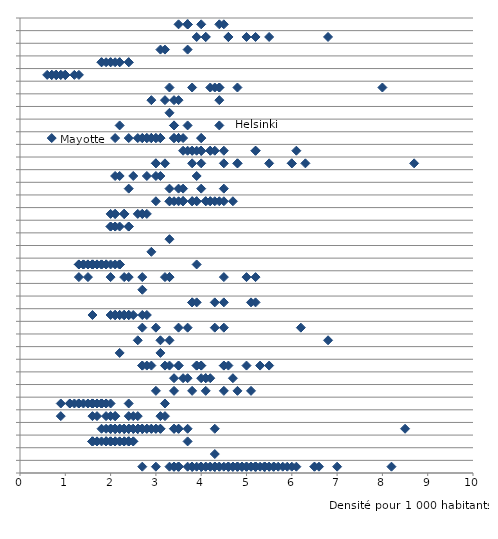
| Category | Series 0 |
|---|---|
| 3.7 | 35.5 |
| 3.7 | 35.5 |
| 3.7 | 35.5 |
| 4.0 | 35.5 |
| 3.5 | 35.5 |
| 3.7 | 35.5 |
| 4.5 | 35.5 |
| 4.4 | 35.5 |
| 3.9 | 34.5 |
| 4.6 | 34.5 |
| 6.8 | 34.5 |
| 4.6 | 34.5 |
| 5.0 | 34.5 |
| 4.1 | 34.5 |
| 5.5 | 34.5 |
| 5.2 | 34.5 |
| 4.1 | 34.5 |
| 3.7 | 33.5 |
| 3.2 | 33.5 |
| 3.1 | 33.5 |
| 2.4 | 32.5 |
| 2.2 | 32.5 |
| 2.4 | 32.5 |
| 2.2 | 32.5 |
| 2.0 | 32.5 |
| 1.9 | 32.5 |
| 2.0 | 32.5 |
| 1.8 | 32.5 |
| 1.8 | 32.5 |
| 2.1 | 32.5 |
| 0.8 | 31.5 |
| 0.6 | 31.5 |
| 0.8 | 31.5 |
| 0.7 | 31.5 |
| 0.9 | 31.5 |
| 0.7 | 31.5 |
| 0.7 | 31.5 |
| 1.0 | 31.5 |
| 0.9 | 31.5 |
| 1.0 | 31.5 |
| 1.3 | 31.5 |
| 1.2 | 31.5 |
| 0.8 | 31.5 |
| 1.0 | 31.5 |
| 0.8 | 31.5 |
| 8.0 | 30.5 |
| 3.3 | 30.5 |
| 4.4 | 30.5 |
| 3.8 | 30.5 |
| 4.2 | 30.5 |
| 4.8 | 30.5 |
| 4.4 | 30.5 |
| 4.3 | 30.5 |
| 4.4 | 29.5 |
| 3.2 | 29.5 |
| 3.4 | 29.5 |
| 3.5 | 29.5 |
| 2.9 | 29.5 |
| 3.3 | 28.5 |
| 3.4 | 27.5 |
| 4.4 | 27.5 |
| 3.4 | 27.5 |
| 3.7 | 27.5 |
| 2.2 | 27.5 |
| 4.0 | 26.5 |
| 2.9 | 26.5 |
| 2.6 | 26.5 |
| 2.8 | 26.5 |
| 2.7 | 26.5 |
| 3.0 | 26.5 |
| 2.9 | 26.5 |
| 3.1 | 26.5 |
| 3.1 | 26.5 |
| 3.5 | 26.5 |
| 3.0 | 26.5 |
| 2.8 | 26.5 |
| 3.1 | 26.5 |
| 2.9 | 26.5 |
| 3.5 | 26.5 |
| 3.5 | 26.5 |
| 3.4 | 26.5 |
| 3.4 | 26.5 |
| 3.1 | 26.5 |
| 3.6 | 26.5 |
| 4.0 | 26.5 |
| 2.9 | 26.5 |
| 2.4 | 26.5 |
| 2.7 | 26.5 |
| 2.1 | 26.5 |
| 3.1 | 26.5 |
| 0.7 | 26.5 |
| 4.0 | 25.5 |
| 4.3 | 25.5 |
| 5.2 | 25.5 |
| 3.6 | 25.5 |
| 5.2 | 25.5 |
| 6.1 | 25.5 |
| 4.0 | 25.5 |
| 4.2 | 25.5 |
| 3.7 | 25.5 |
| 4.2 | 25.5 |
| 3.8 | 25.5 |
| 4.5 | 25.5 |
| 3.9 | 25.5 |
| 3.8 | 25.5 |
| 4.0 | 25.5 |
| 4.0 | 25.5 |
| 8.7 | 24.5 |
| 4.0 | 24.5 |
| 3.2 | 24.5 |
| 6.3 | 24.5 |
| 4.8 | 24.5 |
| 6.0 | 24.5 |
| 3.0 | 24.5 |
| 6.0 | 24.5 |
| 4.8 | 24.5 |
| 4.5 | 24.5 |
| 5.5 | 24.5 |
| 3.0 | 24.5 |
| 3.8 | 24.5 |
| 3.9 | 23.5 |
| 2.2 | 23.5 |
| 2.5 | 23.5 |
| 3.1 | 23.5 |
| 2.1 | 23.5 |
| 2.8 | 23.5 |
| 3.0 | 23.5 |
| 3.5 | 22.5 |
| 2.4 | 22.5 |
| 3.6 | 22.5 |
| 4.0 | 22.5 |
| 4.5 | 22.5 |
| 3.3 | 22.5 |
| 3.5 | 21.5 |
| 3.6 | 21.5 |
| 4.4 | 21.5 |
| 3.6 | 21.5 |
| 4.1 | 21.5 |
| 3.9 | 21.5 |
| 3.8 | 21.5 |
| 3.6 | 21.5 |
| 3.4 | 21.5 |
| 3.8 | 21.5 |
| 4.2 | 21.5 |
| 4.7 | 21.5 |
| 3.0 | 21.5 |
| 3.3 | 21.5 |
| 3.3 | 21.5 |
| 3.9 | 21.5 |
| 4.1 | 21.5 |
| 4.2 | 21.5 |
| 4.3 | 21.5 |
| 3.6 | 21.5 |
| 4.5 | 21.5 |
| 2.3 | 20.5 |
| 2.1 | 20.5 |
| 2.1 | 20.5 |
| 2.3 | 20.5 |
| 2.3 | 20.5 |
| 2.0 | 20.5 |
| 2.6 | 20.5 |
| 2.7 | 20.5 |
| 2.8 | 20.5 |
| 2.7 | 20.5 |
| 2.4 | 19.5 |
| 2.2 | 19.5 |
| 2.1 | 19.5 |
| 2.4 | 19.5 |
| 2.0 | 19.5 |
| 2.0 | 19.5 |
| 2.1 | 19.5 |
| 3.3 | 18.5 |
| 2.9 | 17.5 |
| 2.0 | 16.5 |
| 1.5 | 16.5 |
| 2.2 | 16.5 |
| 2.2 | 16.5 |
| 1.8 | 16.5 |
| 2.2 | 16.5 |
| 1.3 | 16.5 |
| 1.6 | 16.5 |
| 3.9 | 16.5 |
| 1.9 | 16.5 |
| 1.4 | 16.5 |
| 1.4 | 16.5 |
| 1.6 | 16.5 |
| 1.7 | 16.5 |
| 1.3 | 16.5 |
| 1.6 | 16.5 |
| 1.7 | 16.5 |
| 2.1 | 16.5 |
| 1.7 | 16.5 |
| 1.5 | 16.5 |
| 1.3 | 16.5 |
| 1.6 | 16.5 |
| 1.4 | 16.5 |
| 1.6 | 16.5 |
| 1.6 | 16.5 |
| 1.8 | 16.5 |
| 1.9 | 16.5 |
| 1.9 | 16.5 |
| 1.9 | 16.5 |
| 1.5 | 16.5 |
| 1.9 | 16.5 |
| 1.8 | 16.5 |
| 5.0 | 15.5 |
| 2.0 | 15.5 |
| 2.7 | 15.5 |
| 2.4 | 15.5 |
| 3.3 | 15.5 |
| 1.3 | 15.5 |
| 5.2 | 15.5 |
| 4.5 | 15.5 |
| 3.3 | 15.5 |
| 1.5 | 15.5 |
| 2.3 | 15.5 |
| 3.2 | 15.5 |
| 2.7 | 14.5 |
| 5.2 | 13.5 |
| 3.9 | 13.5 |
| 3.8 | 13.5 |
| 3.8 | 13.5 |
| 4.3 | 13.5 |
| 4.5 | 13.5 |
| 5.1 | 13.5 |
| 2.8 | 12.5 |
| 2.7 | 12.5 |
| 2.3 | 12.5 |
| 2.4 | 12.5 |
| 2.4 | 12.5 |
| 2.1 | 12.5 |
| 2.3 | 12.5 |
| 2.5 | 12.5 |
| 1.6 | 12.5 |
| 2.4 | 12.5 |
| 2.1 | 12.5 |
| 2.3 | 12.5 |
| 2.0 | 12.5 |
| 2.2 | 12.5 |
| 2.1 | 12.5 |
| 2.2 | 12.5 |
| 4.5 | 11.5 |
| 3.7 | 11.5 |
| 4.3 | 11.5 |
| 6.2 | 11.5 |
| 2.7 | 11.5 |
| 3.0 | 11.5 |
| 3.5 | 11.5 |
| 6.8 | 10.5 |
| 2.6 | 10.5 |
| 3.1 | 10.5 |
| 3.3 | 10.5 |
| 2.2 | 9.5 |
| 3.1 | 9.5 |
| 4.5 | 8.5 |
| 3.3 | 8.5 |
| 5.5 | 8.5 |
| 5.0 | 8.5 |
| 3.5 | 8.5 |
| 5.3 | 8.5 |
| 3.9 | 8.5 |
| 4.6 | 8.5 |
| 4.5 | 8.5 |
| 2.8 | 8.5 |
| 3.5 | 8.5 |
| 4.0 | 8.5 |
| 3.9 | 8.5 |
| 2.9 | 8.5 |
| 2.7 | 8.5 |
| 4.0 | 8.5 |
| 2.7 | 8.5 |
| 3.2 | 8.5 |
| 4.7 | 7.5 |
| 4.2 | 7.5 |
| 3.6 | 7.5 |
| 4.1 | 7.5 |
| 4.0 | 7.5 |
| 3.4 | 7.5 |
| 3.7 | 7.5 |
| 4.1 | 7.5 |
| 4.8 | 6.5 |
| 3.8 | 6.5 |
| 4.5 | 6.5 |
| 5.1 | 6.5 |
| 3.4 | 6.5 |
| 3.0 | 6.5 |
| 4.1 | 6.5 |
| 1.9 | 5.5 |
| 1.7 | 5.5 |
| 1.4 | 5.5 |
| 2.4 | 5.5 |
| 1.8 | 5.5 |
| 1.5 | 5.5 |
| 1.7 | 5.5 |
| 1.6 | 5.5 |
| 3.2 | 5.5 |
| 1.8 | 5.5 |
| 2.0 | 5.5 |
| 1.6 | 5.5 |
| 1.3 | 5.5 |
| 1.3 | 5.5 |
| 1.8 | 5.5 |
| 1.6 | 5.5 |
| 1.2 | 5.5 |
| 1.6 | 5.5 |
| 1.6 | 5.5 |
| 1.9 | 5.5 |
| 1.1 | 5.5 |
| 1.8 | 5.5 |
| 1.1 | 5.5 |
| 1.3 | 5.5 |
| 1.3 | 5.5 |
| 0.9 | 5.5 |
| 2.4 | 4.5 |
| 2.1 | 4.5 |
| 2.0 | 4.5 |
| 1.6 | 4.5 |
| 1.9 | 4.5 |
| 1.7 | 4.5 |
| 3.2 | 4.5 |
| 0.9 | 4.5 |
| 2.5 | 4.5 |
| 2.6 | 4.5 |
| 3.1 | 4.5 |
| 2.1 | 4.5 |
| 2.1 | 3.5 |
| 2.6 | 3.5 |
| 2.3 | 3.5 |
| 2.0 | 3.5 |
| 2.6 | 3.5 |
| 2.7 | 3.5 |
| 3.4 | 3.5 |
| 2.7 | 3.5 |
| 8.5 | 3.5 |
| 2.6 | 3.5 |
| 2.2 | 3.5 |
| 3.0 | 3.5 |
| 1.9 | 3.5 |
| 2.7 | 3.5 |
| 2.2 | 3.5 |
| 2.1 | 3.5 |
| 2.1 | 3.5 |
| 2.3 | 3.5 |
| 2.4 | 3.5 |
| 3.1 | 3.5 |
| 3.7 | 3.5 |
| 4.3 | 3.5 |
| 2.7 | 3.5 |
| 2.8 | 3.5 |
| 1.8 | 3.5 |
| 2.6 | 3.5 |
| 2.3 | 3.5 |
| 2.3 | 3.5 |
| 2.0 | 3.5 |
| 3.0 | 3.5 |
| 2.9 | 3.5 |
| 2.4 | 3.5 |
| 3.5 | 3.5 |
| 2.4 | 3.5 |
| 2.4 | 3.5 |
| 2.8 | 3.5 |
| 2.0 | 3.5 |
| 2.9 | 3.5 |
| 3.1 | 3.5 |
| 3.5 | 3.5 |
| 2.2 | 3.5 |
| 2.3 | 3.5 |
| 2.5 | 3.5 |
| 2.1 | 3.5 |
| 2.1 | 3.5 |
| 3.4 | 3.5 |
| 2.6 | 3.5 |
| 2.7 | 3.5 |
| 2.5 | 3.5 |
| 2.5 | 3.5 |
| 2.0 | 3.5 |
| 3.7 | 2.5 |
| 2.3 | 2.5 |
| 2.1 | 2.5 |
| 2.4 | 2.5 |
| 2.5 | 2.5 |
| 2.4 | 2.5 |
| 2.3 | 2.5 |
| 2.1 | 2.5 |
| 2.4 | 2.5 |
| 2.1 | 2.5 |
| 2.5 | 2.5 |
| 1.6 | 2.5 |
| 1.9 | 2.5 |
| 1.6 | 2.5 |
| 2.4 | 2.5 |
| 1.9 | 2.5 |
| 2.0 | 2.5 |
| 1.9 | 2.5 |
| 2.0 | 2.5 |
| 1.8 | 2.5 |
| 1.9 | 2.5 |
| 1.9 | 2.5 |
| 2.2 | 2.5 |
| 1.6 | 2.5 |
| 1.6 | 2.5 |
| 1.7 | 2.5 |
| 2.0 | 2.5 |
| 1.7 | 2.5 |
| 2.3 | 2.5 |
| 2.2 | 2.5 |
| 2.4 | 2.5 |
| 4.3 | 1.5 |
| 4.1 | 0.5 |
| 3.7 | 0.5 |
| 3.4 | 0.5 |
| 5.4 | 0.5 |
| 4.8 | 0.5 |
| 4.1 | 0.5 |
| 3.5 | 0.5 |
| 5.2 | 0.5 |
| 4.3 | 0.5 |
| 3.8 | 0.5 |
| 4.3 | 0.5 |
| 5.2 | 0.5 |
| 5.4 | 0.5 |
| 3.4 | 0.5 |
| 4.8 | 0.5 |
| 3.5 | 0.5 |
| 5.8 | 0.5 |
| 6.6 | 0.5 |
| 5.1 | 0.5 |
| 4.8 | 0.5 |
| 5.6 | 0.5 |
| 5.0 | 0.5 |
| 3.5 | 0.5 |
| 4.3 | 0.5 |
| 3.4 | 0.5 |
| 5.5 | 0.5 |
| 4.2 | 0.5 |
| 3.3 | 0.5 |
| 8.2 | 0.5 |
| 3.9 | 0.5 |
| 5.4 | 0.5 |
| 4.0 | 0.5 |
| 6.5 | 0.5 |
| 4.8 | 0.5 |
| 3.8 | 0.5 |
| 4.0 | 0.5 |
| 4.0 | 0.5 |
| 4.6 | 0.5 |
| 3.8 | 0.5 |
| 7.0 | 0.5 |
| 2.7 | 0.5 |
| 4.3 | 0.5 |
| 4.3 | 0.5 |
| 3.5 | 0.5 |
| 5.4 | 0.5 |
| 4.2 | 0.5 |
| 5.4 | 0.5 |
| 4.9 | 0.5 |
| 5.1 | 0.5 |
| 4.6 | 0.5 |
| 4.9 | 0.5 |
| 5.0 | 0.5 |
| 4.0 | 0.5 |
| 4.6 | 0.5 |
| 5.3 | 0.5 |
| 4.0 | 0.5 |
| 3.0 | 0.5 |
| 4.4 | 0.5 |
| 5.2 | 0.5 |
| 5.4 | 0.5 |
| 4.7 | 0.5 |
| 4.3 | 0.5 |
| 4.7 | 0.5 |
| 4.4 | 0.5 |
| 4.7 | 0.5 |
| 4.0 | 0.5 |
| 4.5 | 0.5 |
| 5.2 | 0.5 |
| 5.0 | 0.5 |
| 4.9 | 0.5 |
| 4.6 | 0.5 |
| 5.6 | 0.5 |
| 5.5 | 0.5 |
| 6.1 | 0.5 |
| 5.7 | 0.5 |
| 5.2 | 0.5 |
| 5.2 | 0.5 |
| 5.6 | 0.5 |
| 5.9 | 0.5 |
| 6.0 | 0.5 |
| 4.9 | 0.5 |
| 3.8 | 0.5 |
| 6.5 | 0.5 |